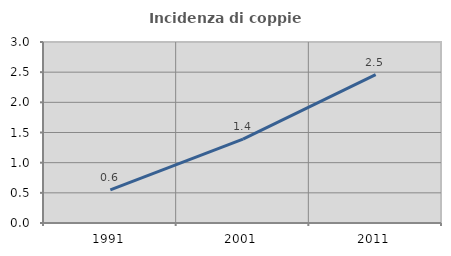
| Category | Incidenza di coppie miste |
|---|---|
| 1991.0 | 0.55 |
| 2001.0 | 1.389 |
| 2011.0 | 2.46 |